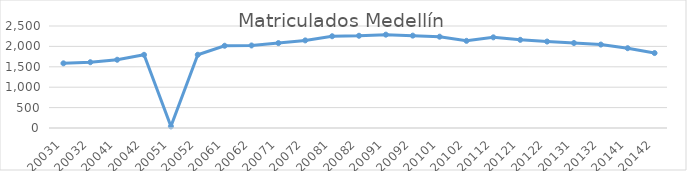
| Category | Matriculados Medellín |
|---|---|
| 20031 | 1585 |
| 20032 | 1612 |
| 20041 | 1673 |
| 20042 | 1794 |
| 20051 | 40 |
| 20052 | 1795 |
| 20061 | 2016 |
| 20062 | 2023 |
| 20071 | 2081 |
| 20072 | 2147 |
| 20081 | 2249 |
| 20082 | 2261 |
| 20091 | 2288 |
| 20092 | 2264 |
| 20101 | 2238 |
| 20102 | 2136 |
| 20112 | 2222 |
| 20121 | 2161 |
| 20122 | 2119 |
| 20131 | 2083 |
| 20132 | 2045 |
| 20141 | 1956 |
| 20142 | 1837 |